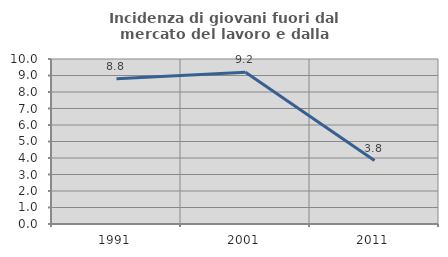
| Category | Incidenza di giovani fuori dal mercato del lavoro e dalla formazione  |
|---|---|
| 1991.0 | 8.8 |
| 2001.0 | 9.195 |
| 2011.0 | 3.846 |